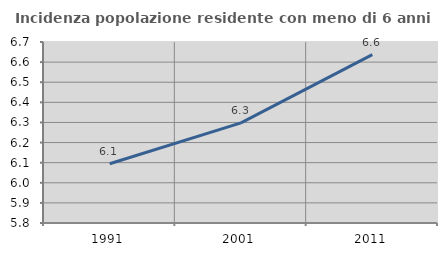
| Category | Incidenza popolazione residente con meno di 6 anni |
|---|---|
| 1991.0 | 6.095 |
| 2001.0 | 6.298 |
| 2011.0 | 6.637 |